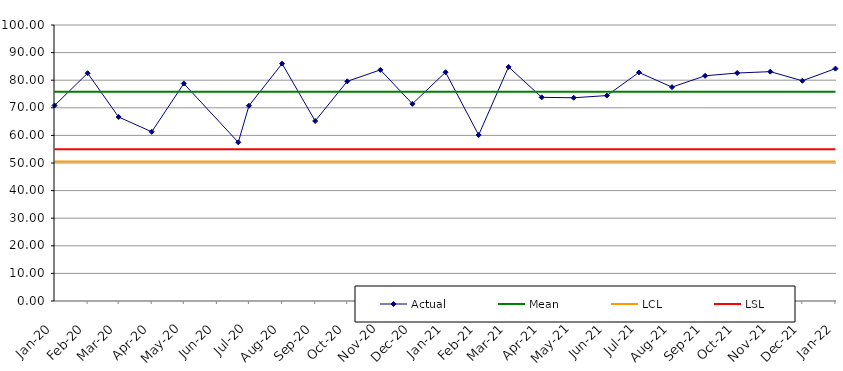
| Category | Actual | Mean | LCL | LSL |
|---|---|---|---|---|
| 2020-01-01 | 70.84 | 75.827 | 50.544 | 55 |
| 2020-02-01 | 82.54 | 75.827 | 50.544 | 55 |
| 2020-03-01 | 66.67 | 75.827 | 50.544 | 55 |
| 2020-04-01 | 61.3 | 75.827 | 50.544 | 55 |
| 2020-05-01 | 78.79 | 75.827 | 50.544 | 55 |
| 2020-06-21 | 57.5 | 75.827 | 50.544 | 55 |
| 2020-07-01 | 70.74 | 75.827 | 50.544 | 55 |
| 2020-08-01 | 86 | 75.827 | 50.544 | 55 |
| 2020-09-01 | 65.22 | 75.827 | 50.544 | 55 |
| 2020-10-01 | 79.6 | 75.827 | 50.544 | 55 |
| 2020-11-01 | 83.73 | 75.827 | 50.544 | 55 |
| 2020-12-01 | 71.43 | 75.827 | 50.544 | 55 |
| 2021-01-01 | 82.89 | 75.827 | 50.544 | 55 |
| 2021-02-01 | 60.14 | 75.827 | 50.544 | 55 |
| 2021-03-01 | 84.82 | 75.827 | 50.544 | 55 |
| 2021-04-01 | 73.79 | 75.827 | 50.544 | 55 |
| 2021-05-01 | 73.64 | 75.827 | 50.544 | 55 |
| 2021-06-01 | 74.43 | 75.827 | 50.544 | 55 |
| 2021-07-01 | 82.81 | 75.827 | 50.544 | 55 |
| 2021-08-01 | 77.5 | 75.827 | 50.544 | 55 |
| 2021-09-01 | 81.59 | 75.827 | 50.544 | 55 |
| 2021-10-01 | 82.6 | 75.827 | 50.544 | 55 |
| 2021-11-01 | 83.1 | 75.827 | 50.544 | 55 |
| 2021-12-01 | 79.8 | 75.827 | 50.544 | 55 |
| 2022-01-01 | 84.2 | 75.827 | 50.544 | 55 |